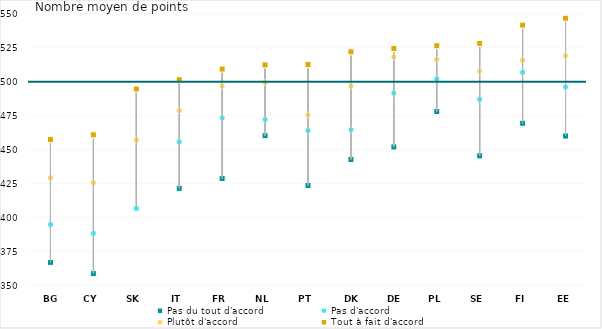
| Category | Pas du tout d'accord | Pas d'accord | Plutôt d'accord | Tout à fait d'accord |
|---|---|---|---|---|
| BG | 366.688 | 394.647 | 429.1 | 457.408 |
| CY | 358.401 | 388.13 | 425.469 | 460.826 |
| SK | 406.467 | 406.562 | 457.148 | 494.698 |
| IT | 421.35 | 455.685 | 478.733 | 501.5 |
| FR | 428.61 | 473.341 | 496.818 | 509.328 |
| NL | 460.181 | 472.121 | 499.368 | 512.416 |
| PT | 423.431 | 463.966 | 475.479 | 512.627 |
| DK | 442.628 | 464.656 | 496.845 | 522.112 |
| DE | 451.871 | 491.598 | 518.238 | 524.571 |
| PL | 478.003 | 502.129 | 516.418 | 526.571 |
| SE | 445.307 | 487.067 | 507.903 | 528.312 |
| FI | 469.386 | 506.932 | 515.723 | 541.791 |
| EE | 459.957 | 496.115 | 519.143 | 546.856 |